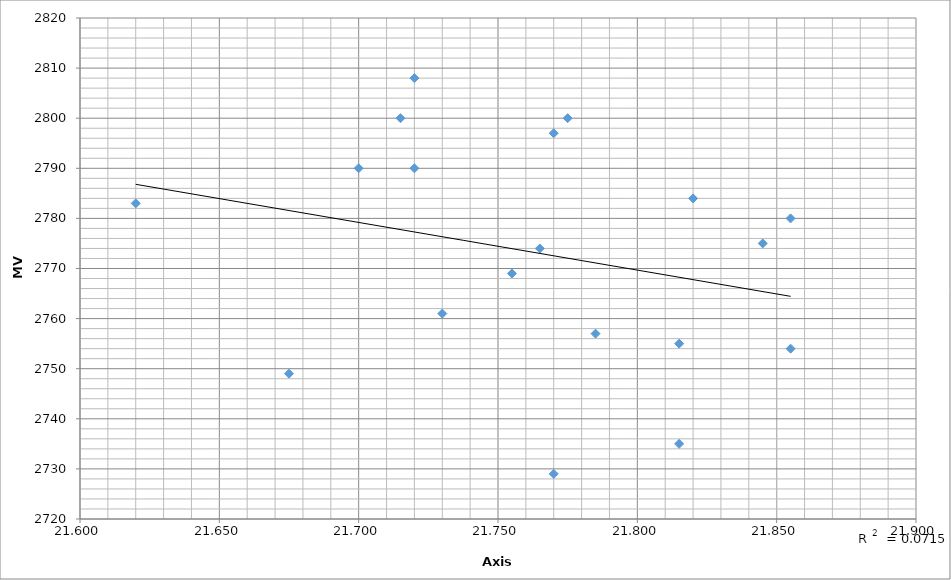
| Category | MV (fps) |
|---|---|
| 21.675 | 2783 |
| 21.7 | 2749 |
| 21.715 | 2790 |
| 21.72 | 2800 |
| 21.72 | 2790 |
| 21.73 | 2808 |
| 21.755 | 2761 |
| 21.765 | 2769 |
| 21.77 | 2774 |
| 21.77 | 2729 |
| 21.775 | 2797 |
| 21.785 | 2800 |
| 21.815 | 2757 |
| 21.815 | 2735 |
| 21.82 | 2755 |
| 21.845 | 2784 |
| 21.855 | 2775 |
| 21.855 | 2780 |
| 21.92 | 2754 |